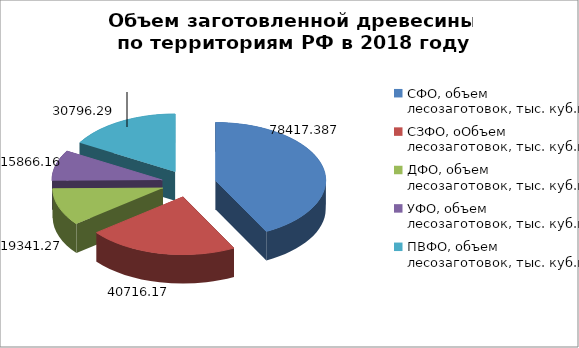
| Category | Series 0 |
|---|---|
| СФО, объем лесозаготовок, тыс. куб.м.  | 78417.387 |
| СЗФО, оОбъем лесозаготовок, тыс. куб.м. | 40716.17 |
| ДФО, объем лесозаготовок, тыс. куб.м. | 19341.27 |
| УФО, объем лесозаготовок, тыс. куб.м. | 15866.16 |
| ПВФО, объем лесозаготовок, тыс. куб.м. | 30796.29 |